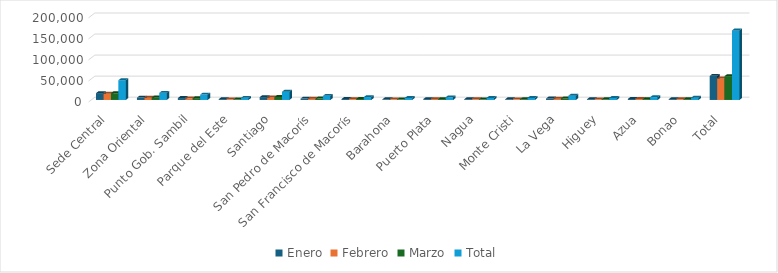
| Category | Enero | Febrero | Marzo | Total |
|---|---|---|---|---|
| Sede Central | 16222 | 14682 | 15901 | 46805 |
| Zona Oriental | 5609 | 5302 | 6032 | 16943 |
| Punto Gob. Sambil | 4555 | 3813 | 4410 | 12778 |
| Parque del Este | 1925 | 1518 | 1567 | 5010 |
| Santiago | 6720 | 5834 | 7012 | 19566 |
| San Pedro de Macorís | 3268 | 3112 | 3367 | 9747 |
| San Francisco de Macorís | 2270 | 2026 | 2564 | 6860 |
| Barahona | 1608 | 1523 | 1480 | 4611 |
| Puerto Plata | 2149 | 1988 | 2143 | 6280 |
| Nagua | 1762 | 1578 | 1493 | 4833 |
| Monte Cristi | 1660 | 1407 | 1722 | 4789 |
| La Vega | 3446 | 3080 | 3487 | 10013 |
| Higuey | 1774 | 1533 | 1643 | 4950 |
| Azua | 2459 | 2224 | 2072 | 6755 |
| Bonao | 1865 | 1574 | 1853 | 5292 |
| Total | 57292 | 51194 | 56746 | 165232 |